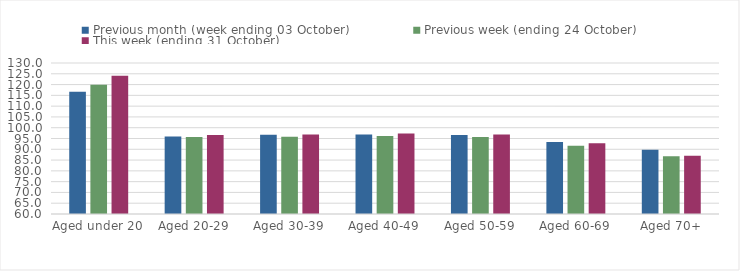
| Category | Previous month (week ending 03 October) | Previous week (ending 24 October) | This week (ending 31 October) |
|---|---|---|---|
| Aged under 20 | 116.69 | 119.94 | 124.1 |
| Aged 20-29 | 95.95 | 95.71 | 96.68 |
| Aged 30-39 | 96.73 | 95.8 | 96.81 |
| Aged 40-49 | 96.89 | 96.14 | 97.31 |
| Aged 50-59 | 96.58 | 95.64 | 96.86 |
| Aged 60-69 | 93.43 | 91.61 | 92.84 |
| Aged 70+ | 89.8 | 86.77 | 86.99 |